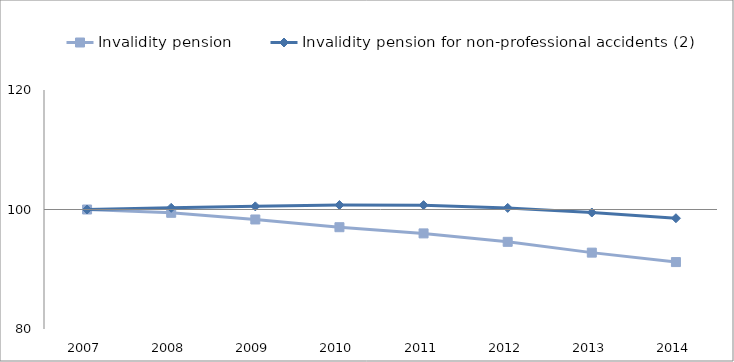
| Category | Invalidity pension | Invalidity pension for non-professional accidents (2) | 0 |
|---|---|---|---|
| 2007.0 | 100 | 100 |  |
| 2008.0 | 99.447 | 100.281 |  |
| 2009.0 | 98.33 | 100.525 |  |
| 2010.0 | 97.037 | 100.747 |  |
| 2011.0 | 96.001 | 100.728 |  |
| 2012.0 | 94.588 | 100.266 |  |
| 2013.0 | 92.781 | 99.497 |  |
| 2014.0 | 91.202 | 98.54 |  |